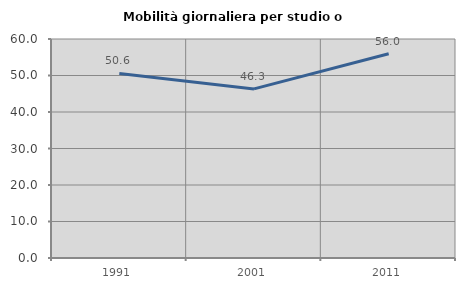
| Category | Mobilità giornaliera per studio o lavoro |
|---|---|
| 1991.0 | 50.552 |
| 2001.0 | 46.329 |
| 2011.0 | 55.959 |